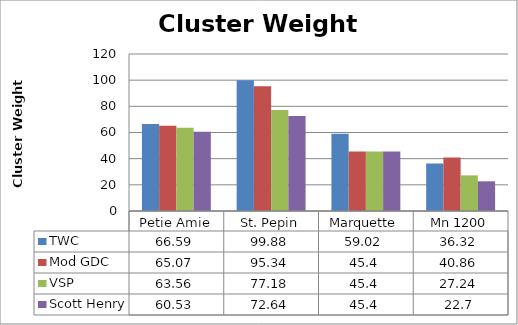
| Category | TWC | Mod GDC | VSP | Scott Henry |
|---|---|---|---|---|
| 0 | 66.59 | 65.07 | 63.56 | 60.53 |
| 1 | 99.88 | 95.34 | 77.18 | 72.64 |
| 2 | 59.02 | 45.4 | 45.4 | 45.4 |
| 3 | 36.32 | 40.86 | 27.24 | 22.7 |